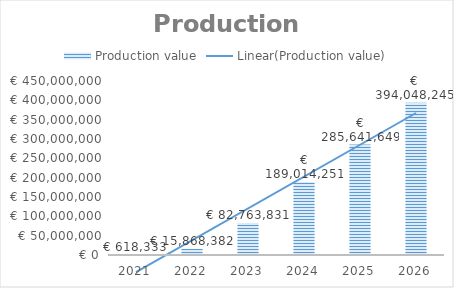
| Category | Production value |
|---|---|
| 2021.0 | 618333.333 |
| 2022.0 | 15868382.26 |
| 2023.0 | 82763830.721 |
| 2024.0 | 189014250.595 |
| 2025.0 | 285641648.761 |
| 2026.0 | 394048244.625 |